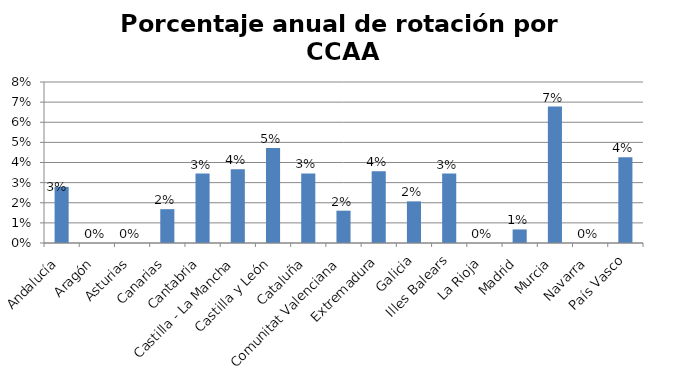
| Category | Porcentaje |
|---|---|
| Andalucía | 0.028 |
| Aragón | 0 |
| Asturias | 0 |
| Canarias | 0.017 |
| Cantabria | 0.034 |
| Castilla - La Mancha | 0.037 |
| Castilla y León | 0.047 |
| Cataluña | 0.035 |
| Comunitat Valenciana | 0.016 |
| Extremadura | 0.036 |
| Galicia | 0.021 |
| Illes Balears | 0.034 |
| La Rioja | 0 |
| Madrid | 0.007 |
| Murcia | 0.068 |
| Navarra | 0 |
| País Vasco | 0.043 |